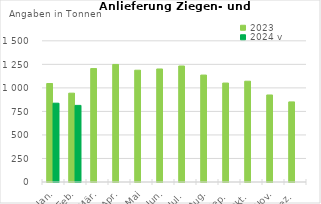
| Category | 2023 | 2024 v |
|---|---|---|
| 0 | 1046.448 | 837.503 |
| 1 | 943.911 | 813.979 |
| 2 | 1205.32 | 0 |
| 3 | 1249.007 | 0 |
| 4 | 1187.736 | 0 |
| 5 | 1200.847 | 0 |
| 6 | 1232.488 | 0 |
| 7 | 1136.129 | 0 |
| 8 | 1051.239 | 0 |
| 9 | 1070.827 | 0 |
| 10 | 924.657 | 0 |
| 11 | 850.93 | 0 |